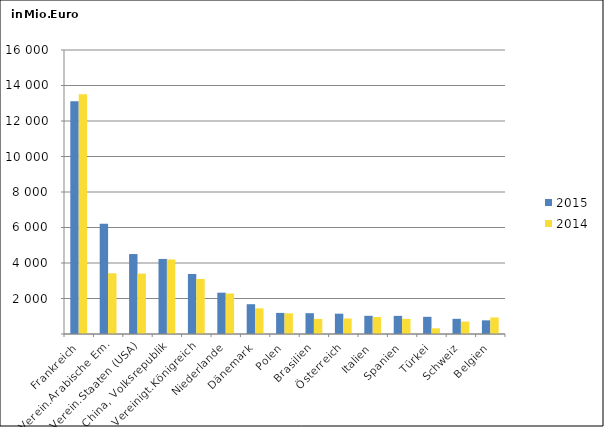
| Category | 2015 | 2014 |
|---|---|---|
| Frankreich | 13106.191 | 13513.967 |
| Verein.Arabische Em. | 6215.225 | 3419.548 |
| Verein.Staaten (USA) | 4504.952 | 3403.409 |
| China, Volksrepublik | 4228.785 | 4200.546 |
| Vereinigt.Königreich | 3378.936 | 3102.151 |
| Niederlande | 2327.606 | 2283.169 |
| Dänemark | 1678.832 | 1445.402 |
| Polen | 1188.419 | 1164.915 |
| Brasilien | 1171.764 | 852.239 |
| Österreich | 1144.253 | 873.685 |
| Italien | 1025.286 | 956.01 |
| Spanien | 1020.96 | 852.372 |
| Türkei | 967.982 | 321.753 |
| Schweiz | 854.715 | 697.926 |
| Belgien | 769.824 | 931.388 |